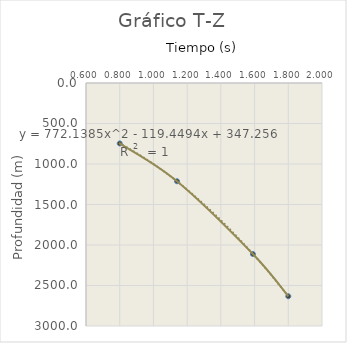
| Category | Series 0 |
|---|---|
| 0.8 | 746.4 |
| 1.14 | 1213.132 |
| 1.59 | 2111.299 |
| 1.8 | 2632.939 |